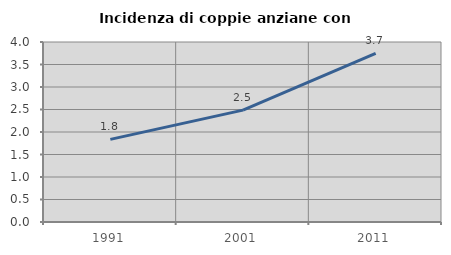
| Category | Incidenza di coppie anziane con figli |
|---|---|
| 1991.0 | 1.837 |
| 2001.0 | 2.486 |
| 2011.0 | 3.748 |